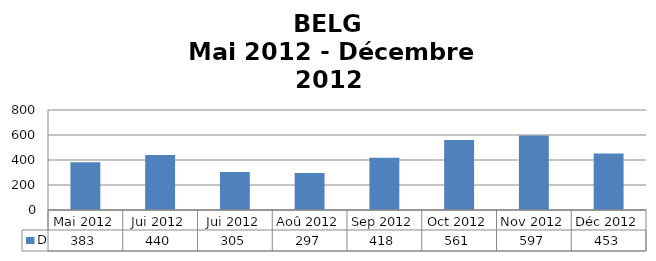
| Category | D |
|---|---|
| Mai 2012 | 383 |
| Jui 2012 | 440 |
| Jui 2012 | 305 |
| Aoû 2012 | 297 |
| Sep 2012 | 418 |
| Oct 2012 | 561 |
| Nov 2012 | 597 |
| Déc 2012 | 453 |